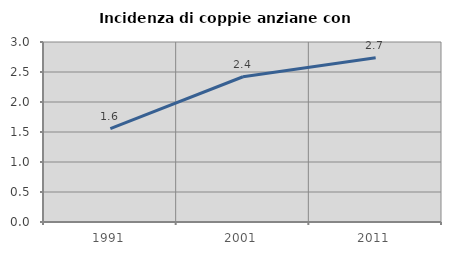
| Category | Incidenza di coppie anziane con figli |
|---|---|
| 1991.0 | 1.556 |
| 2001.0 | 2.421 |
| 2011.0 | 2.739 |